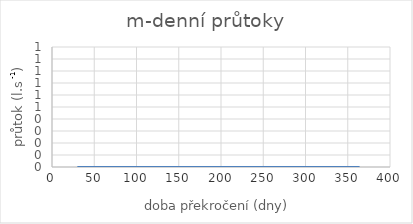
| Category | m-denní průtoky |
|---|---|
| 30.0 | 0 |
| 60.0 | 0 |
| 90.0 | 0 |
| 120.0 | 0 |
| 150.0 | 0 |
| 180.0 | 0 |
| 210.0 | 0 |
| 240.0 | 0 |
| 270.0 | 0 |
| 300.0 | 0 |
| 330.0 | 0 |
| 355.0 | 0 |
| 364.0 | 0 |